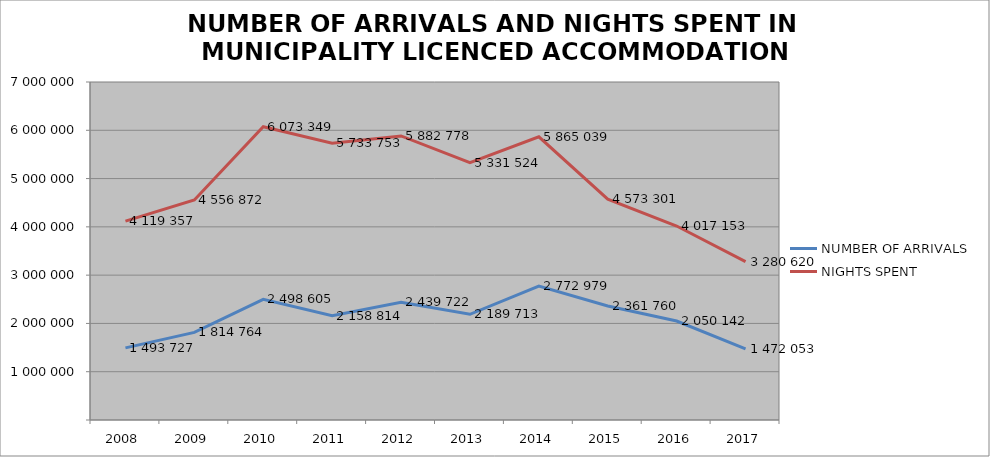
| Category | NUMBER OF ARRIVALS | NIGHTS SPENT |
|---|---|---|
| 2008 | 1493727 | 4119357 |
| 2009 | 1814764 | 4556872 |
| 2010 | 2498605 | 6073349 |
| 2011 | 2158814 | 5733753 |
| 2012 | 2439722 | 5882778 |
| 2013 | 2189713 | 5331524 |
| 2014 | 2772979 | 5865039 |
| 2015 | 2361760 | 4573301 |
| 2016 | 2050142 | 4017153 |
| 2017 | 1472053 | 3280620 |